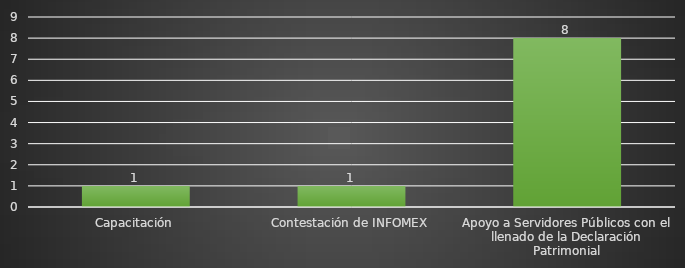
| Category | INDICADOR  |
|---|---|
| Capacitación | 1 |
| Contestación de INFOMEX | 1 |
| Apoyo a Servidores Públicos con el llenado de la Declaración Patrimonial | 8 |